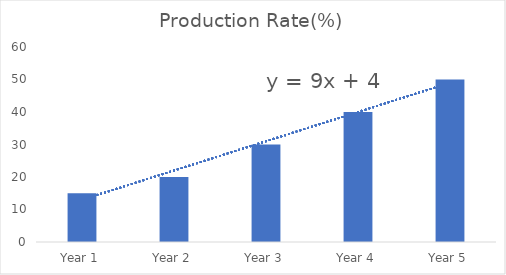
| Category | Production Rate(%) |
|---|---|
| Year 1 | 15 |
| Year 2 | 20 |
| Year 3 | 30 |
| Year 4 | 40 |
| Year 5 | 50 |